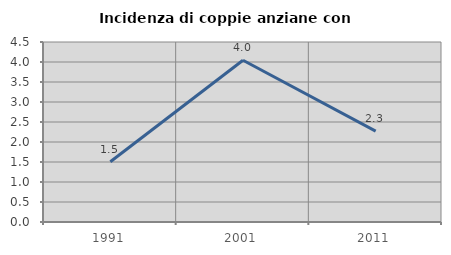
| Category | Incidenza di coppie anziane con figli |
|---|---|
| 1991.0 | 1.506 |
| 2001.0 | 4.043 |
| 2011.0 | 2.273 |